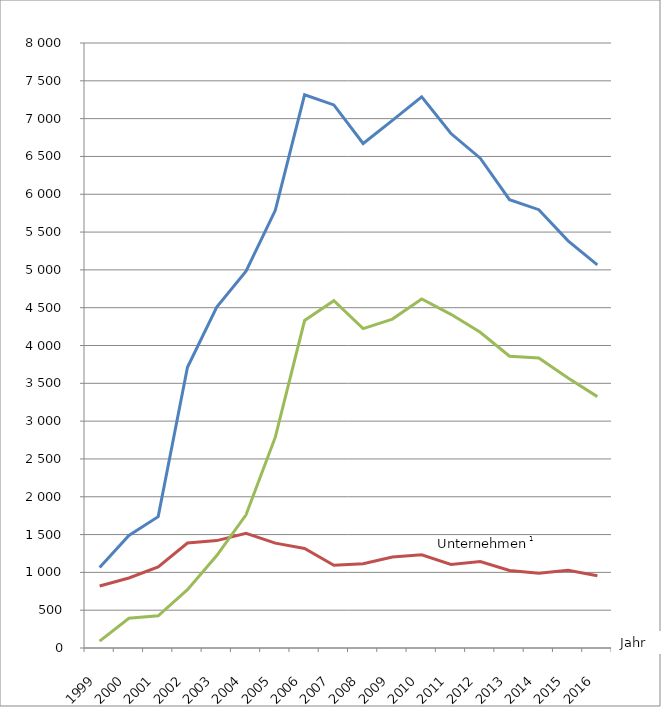
| Category | Verfahren
Insgesamt | von Unternehmen1 | von Verbrauchern |
|---|---|---|---|
| 1999.0 | 1064 | 820 | 91 |
| 2000.0 | 1488 | 926 | 394 |
| 2001.0 | 1737 | 1072 | 425 |
| 2002.0 | 3712 | 1388 | 772 |
| 2003.0 | 4507 | 1420 | 1222 |
| 2004.0 | 4984 | 1516 | 1761 |
| 2005.0 | 5788 | 1387 | 2788 |
| 2006.0 | 7315 | 1317 | 4330 |
| 2007.0 | 7181 | 1095 | 4592 |
| 2008.0 | 6671 | 1114 | 4223 |
| 2009.0 | 6976 | 1203 | 4349 |
| 2010.0 | 7287 | 1233 | 4615 |
| 2011.0 | 6803 | 1104 | 4412 |
| 2012.0 | 6477 | 1143 | 4175 |
| 2013.0 | 5928 | 1026 | 3858 |
| 2014.0 | 5796 | 987 | 3835 |
| 2015.0 | 5384 | 1027 | 3569 |
| 2016.0 | 5067 | 956 | 3324 |